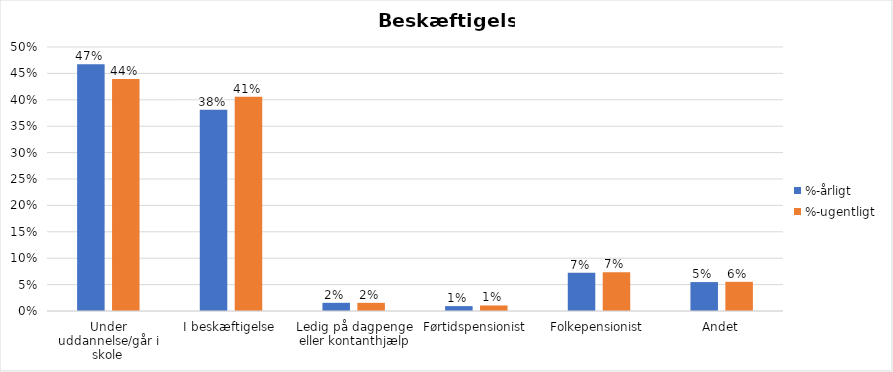
| Category | %-årligt | %-ugentligt |
|---|---|---|
| Under uddannelse/går i skole | 0.467 | 0.439 |
| I beskæftigelse | 0.381 | 0.406 |
| Ledig på dagpenge eller kontanthjælp | 0.016 | 0.015 |
| Førtidspensionist | 0.009 | 0.011 |
| Folkepensionist | 0.072 | 0.074 |
| Andet | 0.055 | 0.055 |